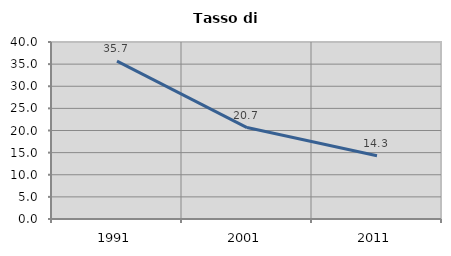
| Category | Tasso di disoccupazione   |
|---|---|
| 1991.0 | 35.687 |
| 2001.0 | 20.662 |
| 2011.0 | 14.298 |